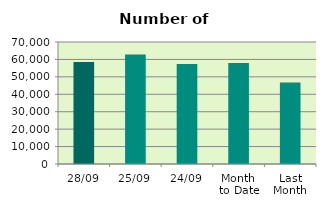
| Category | Series 0 |
|---|---|
| 28/09 | 58464 |
| 25/09 | 62880 |
| 24/09 | 57418 |
| Month 
to Date | 57984.2 |
| Last
Month | 46763.238 |